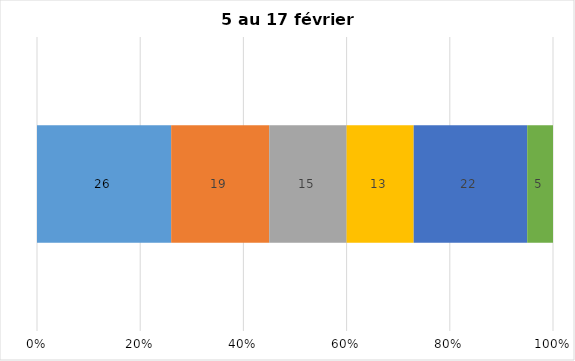
| Category | Plusieurs fois par jour | Une fois par jour | Quelques fois par semaine   | Une fois par semaine ou moins   |  Jamais   |  Je n’utilise pas les médias sociaux |
|---|---|---|---|---|---|---|
| 0 | 26 | 19 | 15 | 13 | 22 | 5 |